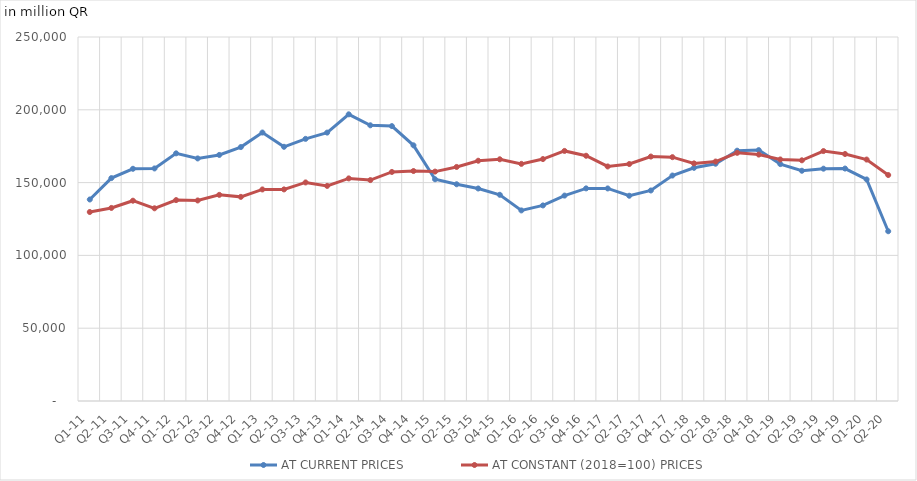
| Category | AT CURRENT PRICES | AT CONSTANT (2018=100) PRICES |
|---|---|---|
| Q1-11 | 138401.271 | 129804.239 |
| Q2-11 | 153089.762 | 132598.031 |
| Q3-11 | 159487.561 | 137565.295 |
| Q4-11 | 159723.384 | 132348.861 |
| Q1-12 | 170083.093 | 137982.104 |
| Q2-12 | 166591.685 | 137726.476 |
| Q3-12 | 168996.873 | 141580.056 |
| Q4-12 | 174402.297 | 140206.421 |
| Q1-13 | 184386.906 | 145295.802 |
| Q2-13 | 174597.258 | 145323.774 |
| Q3-13 | 180040.866 | 150108.501 |
| Q4-13 | 184343.591 | 147741.63 |
| Q1-14 | 196893.097 | 152884.316 |
| Q2-14 | 189356.652 | 151722.456 |
| Q3-14 | 188804.036 | 157306.957 |
| Q4-14 | 175603.753 | 157946.856 |
| Q1-15 | 152296.294 | 157548.933 |
| Q2-15 | 148854.913 | 160746.996 |
| Q3-15 | 145953.812 | 165017.31 |
| Q4-15 | 141628.419 | 166011.462 |
| Q1-16 | 130891.648 | 162867.899 |
| Q2-16 | 134312.351 | 166165.592 |
| Q3-16 | 141077.114 | 171750.759 |
| Q4-16 | 146024.029 | 168437.006 |
| Q1-17 | 145986.575 | 161083.599 |
| Q2-17 | 140973.578 | 162753.554 |
| Q3-17 | 144588.415 | 167889.538 |
| Q4-17 | 154852.238 | 167472.277 |
| Q1-18 | 160151.745 | 163190.321 |
| Q2-18 | 162958.727 | 164459.507 |
| Q3-18 | 171916.892 | 170445.991 |
| Q4-18 | 172311.868 | 169243.414 |
| Q1-19 | 162706.326 | 165895.897 |
| Q2-19 | 158139.213 | 165311.561 |
| Q3-19 | 159554.548 | 171662.34 |
| Q4-19 | 159648.598 | 169640.034 |
| Q1-20 | 152164.114 | 165822.724 |
| Q2-20 | 116591.341 | 155195.763 |